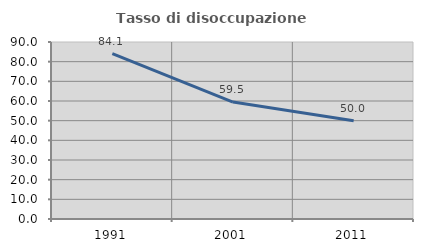
| Category | Tasso di disoccupazione giovanile  |
|---|---|
| 1991.0 | 84.138 |
| 2001.0 | 59.459 |
| 2011.0 | 50 |